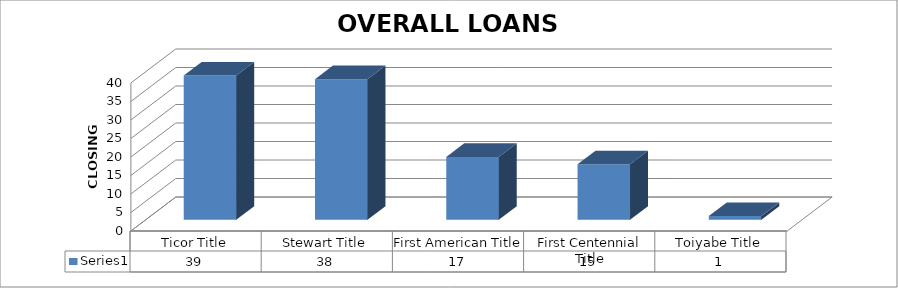
| Category | Series 0 |
|---|---|
| Ticor Title | 39 |
| Stewart Title | 38 |
| First American Title | 17 |
| First Centennial Title | 15 |
| Toiyabe Title | 1 |